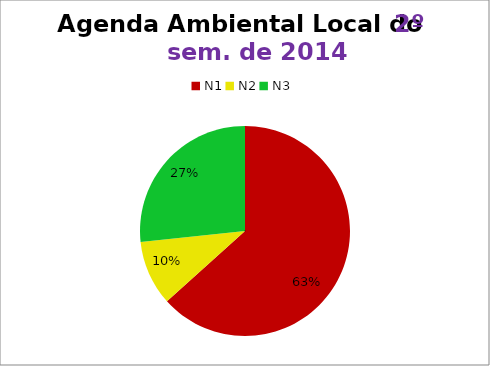
| Category | 2º/14 |
|---|---|
| N1 | 19 |
| N2 | 3 |
| N3 | 8 |